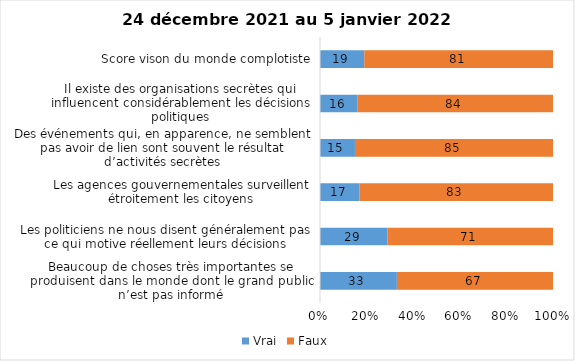
| Category | Vrai | Faux |
|---|---|---|
| Beaucoup de choses très importantes se produisent dans le monde dont le grand public n’est pas informé | 33 | 67 |
| Les politiciens ne nous disent généralement pas ce qui motive réellement leurs décisions | 29 | 71 |
| Les agences gouvernementales surveillent étroitement les citoyens | 17 | 83 |
| Des événements qui, en apparence, ne semblent pas avoir de lien sont souvent le résultat d’activités secrètes | 15 | 85 |
| Il existe des organisations secrètes qui influencent considérablement les décisions politiques | 16 | 84 |
| Score vison du monde complotiste | 19 | 81 |